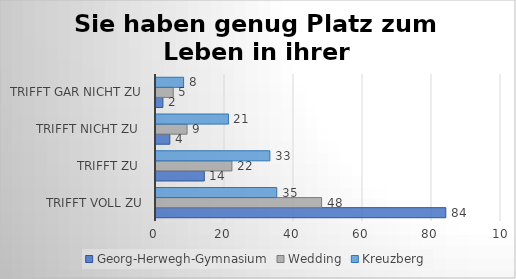
| Category | Georg-Herwegh-Gymnasium | Wedding | Kreuzberg |
|---|---|---|---|
| trifft voll zu | 84 | 48 | 35 |
| trifft zu  | 14 | 22 | 33 |
| trifft nicht zu  | 4 | 9 | 21 |
| trifft gar nicht zu | 2 | 5 | 8 |